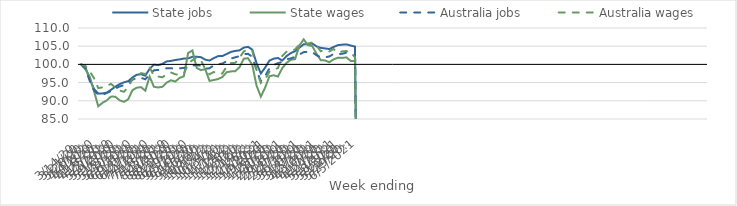
| Category | State jobs | State wages | Australia jobs | Australia wages |
|---|---|---|---|---|
| 14/03/2020 | 100 | 100 | 100 | 100 |
| 21/03/2020 | 99.176 | 98.604 | 98.972 | 99.605 |
| 28/03/2020 | 95.989 | 96.658 | 95.467 | 98.106 |
| 04/04/2020 | 93.279 | 92.66 | 92.921 | 96.238 |
| 11/04/2020 | 91.986 | 88.492 | 91.648 | 93.491 |
| 18/04/2020 | 92.034 | 89.456 | 91.631 | 93.694 |
| 25/04/2020 | 92.257 | 90.113 | 92.161 | 94.113 |
| 02/05/2020 | 93.042 | 91.217 | 92.658 | 94.66 |
| 09/05/2020 | 93.88 | 91.091 | 93.343 | 93.583 |
| 16/05/2020 | 94.587 | 90.143 | 93.936 | 92.817 |
| 23/05/2020 | 95.072 | 89.714 | 94.294 | 92.471 |
| 30/05/2020 | 95.398 | 90.417 | 94.802 | 93.799 |
| 06/06/2020 | 96.414 | 92.933 | 95.786 | 95.975 |
| 13/06/2020 | 97.166 | 93.602 | 96.286 | 96.648 |
| 20/06/2020 | 97.281 | 93.748 | 96.302 | 97.605 |
| 27/06/2020 | 96.913 | 92.779 | 95.914 | 97.364 |
| 04/07/2020 | 98.776 | 96.648 | 97.234 | 99.209 |
| 11/07/2020 | 99.917 | 93.868 | 98.377 | 96.842 |
| 18/07/2020 | 99.79 | 93.661 | 98.483 | 96.672 |
| 25/07/2020 | 100.129 | 93.846 | 98.707 | 96.464 |
| 01/08/2020 | 100.824 | 95.006 | 98.939 | 97.319 |
| 08/08/2020 | 100.962 | 95.641 | 98.937 | 97.774 |
| 15/08/2020 | 101.212 | 95.284 | 98.822 | 97.284 |
| 22/08/2020 | 101.366 | 96.302 | 98.911 | 97.15 |
| 29/08/2020 | 101.61 | 96.728 | 99.048 | 97.377 |
| 05/09/2020 | 101.656 | 103.124 | 99.236 | 100.159 |
| 12/09/2020 | 102.067 | 103.824 | 99.656 | 101.158 |
| 19/09/2020 | 102.116 | 99.04 | 99.825 | 101.963 |
| 26/09/2020 | 101.981 | 98.415 | 99.625 | 101.122 |
| 03/10/2020 | 101.301 | 98.705 | 98.824 | 98.703 |
| 10/10/2020 | 101.062 | 95.478 | 98.93 | 97.286 |
| 17/10/2020 | 101.725 | 95.716 | 99.758 | 97.926 |
| 24/10/2020 | 102.27 | 95.968 | 100.051 | 97.346 |
| 31/10/2020 | 102.295 | 96.52 | 100.234 | 97.513 |
| 07/11/2020 | 102.847 | 97.842 | 100.843 | 99.39 |
| 14/11/2020 | 103.439 | 98.075 | 101.614 | 100.362 |
| 21/11/2020 | 103.697 | 98.117 | 101.941 | 100.423 |
| 28/11/2020 | 103.856 | 99.221 | 102.262 | 101.777 |
| 05/12/2020 | 104.597 | 101.571 | 102.828 | 103.567 |
| 12/12/2020 | 104.826 | 101.697 | 102.902 | 104.028 |
| 19/12/2020 | 104.057 | 99.844 | 102.101 | 103.902 |
| 26/12/2020 | 100.318 | 94.146 | 98.307 | 98.441 |
| 02/01/2021 | 97.51 | 91.149 | 95.41 | 94.903 |
| 09/01/2021 | 99.115 | 93.631 | 96.79 | 95.912 |
| 16/01/2021 | 101.029 | 96.722 | 98.893 | 97.958 |
| 23/01/2021 | 101.584 | 97.019 | 99.862 | 98.634 |
| 30/01/2021 | 101.766 | 96.656 | 100.346 | 98.978 |
| 06/02/2021 | 101.053 | 98.961 | 100.698 | 102.329 |
| 13/02/2021 | 102.274 | 100.428 | 101.406 | 103.465 |
| 20/02/2021 | 103.12 | 101.261 | 101.644 | 103.55 |
| 27/02/2021 | 103.622 | 101.462 | 102.078 | 104.122 |
| 06/03/2021 | 104.598 | 105.153 | 102.697 | 105.405 |
| 13/03/2021 | 105.515 | 106.874 | 103.369 | 105.802 |
| 20/03/2021 | 105.536 | 105.298 | 103.483 | 105.731 |
| 27/03/2021 | 105.731 | 105.032 | 103.4 | 106.023 |
| 03/04/2021 | 104.947 | 102.966 | 102.51 | 105.184 |
| 10/04/2021 | 104.545 | 101.168 | 101.979 | 103.615 |
| 17/04/2021 | 104.388 | 101.088 | 101.926 | 103.956 |
| 24/04/2021 | 104.211 | 100.611 | 102.186 | 103.563 |
| 01/05/2021 | 104.777 | 101.377 | 102.848 | 104.217 |
| 08/05/2021 | 105.286 | 101.831 | 102.834 | 103.251 |
| 15/05/2021 | 105.42 | 101.787 | 102.922 | 103.573 |
| 22/05/2021 | 105.498 | 101.938 | 103.224 | 103.677 |
| 29/05/2021 | 105.186 | 100.942 | 102.941 | 102.856 |
| 05/06/2021 | 104.885 | 100.897 | 102.252 | 102.059 |